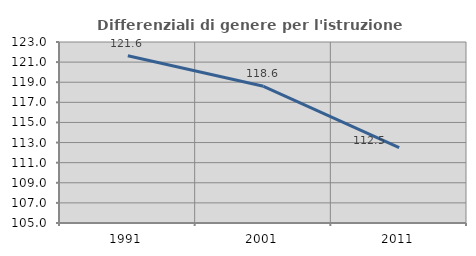
| Category | Differenziali di genere per l'istruzione superiore |
|---|---|
| 1991.0 | 121.63 |
| 2001.0 | 118.594 |
| 2011.0 | 112.491 |